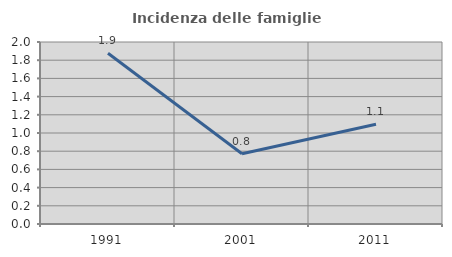
| Category | Incidenza delle famiglie numerose |
|---|---|
| 1991.0 | 1.877 |
| 2001.0 | 0.772 |
| 2011.0 | 1.096 |